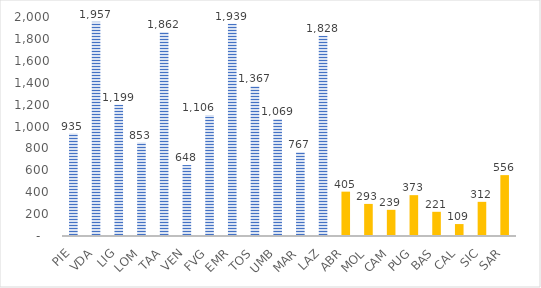
| Category | nidi e sezioni primavera |
|---|---|
| PIE | 935 |
| VDA | 1957 |
| LIG | 1199 |
| LOM | 853 |
| TAA | 1862 |
| VEN | 648 |
| FVG | 1106 |
| EMR | 1939 |
| TOS | 1367 |
| UMB | 1069 |
| MAR | 767 |
| LAZ | 1828 |
| ABR | 405 |
| MOL | 293 |
| CAM | 239 |
| PUG | 373 |
| BAS | 221 |
| CAL | 109 |
| SIC | 312 |
| SAR | 556 |